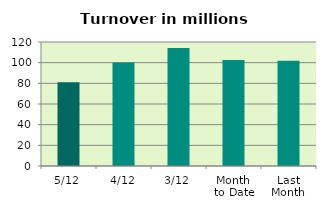
| Category | Series 0 |
|---|---|
| 5/12 | 81.063 |
| 4/12 | 100.148 |
| 3/12 | 114.184 |
| Month 
to Date | 102.585 |
| Last
Month | 101.866 |